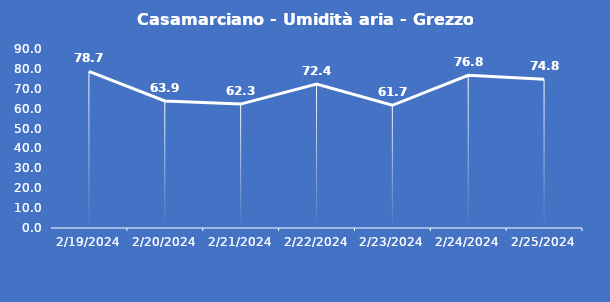
| Category | Casamarciano - Umidità aria - Grezzo (%) |
|---|---|
| 2/19/24 | 78.7 |
| 2/20/24 | 63.9 |
| 2/21/24 | 62.3 |
| 2/22/24 | 72.4 |
| 2/23/24 | 61.7 |
| 2/24/24 | 76.8 |
| 2/25/24 | 74.8 |